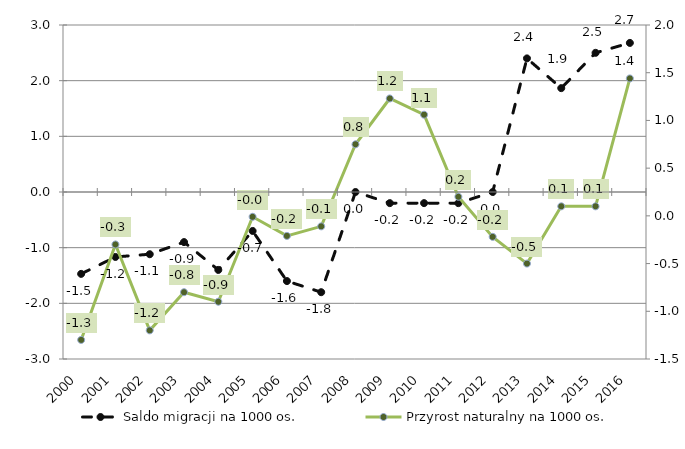
| Category | Saldo migracji na 1000 os. |
|---|---|
| 2000.0 | -1.471 |
| 2001.0 | -1.167 |
| 2002.0 | -1.118 |
| 2003.0 | -0.9 |
| 2004.0 | -1.4 |
| 2005.0 | -0.7 |
| 2006.0 | -1.6 |
| 2007.0 | -1.8 |
| 2008.0 | 0 |
| 2009.0 | -0.2 |
| 2010.0 | -0.2 |
| 2011.0 | -0.2 |
| 2012.0 | 0 |
| 2013.0 | 2.4 |
| 2014.0 | 1.866 |
| 2015.0 | 2.5 |
| 2016.0 | 2.678 |